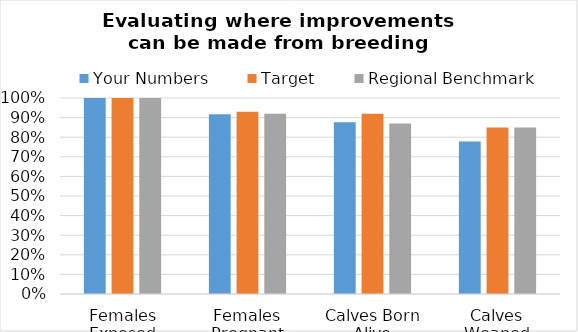
| Category | Your Numbers | Target | Regional Benchmark |
|---|---|---|---|
| Females Exposed | 1 | 1 | 1 |
| Females Pregnant | 0.917 | 0.93 | 0.92 |
| Calves Born Alive | 0.876 | 0.92 | 0.87 |
| Calves Weaned | 0.778 | 0.85 | 0.85 |